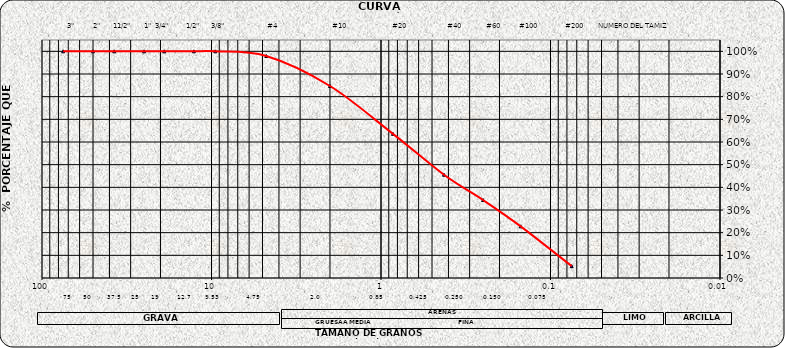
| Category | Series 0 |
|---|---|
| 75.0 | 1 |
| 50.0 | 1 |
| 37.5 | 1 |
| 25.0 | 1 |
| 19.0 | 1 |
| 12.7 | 1 |
| 9.5 | 1 |
| 4.75 | 0.979 |
| 2.0 | 0.847 |
| 0.85 | 0.636 |
| 0.425 | 0.456 |
| 0.25 | 0.344 |
| 0.15 | 0.228 |
| 0.075 | 0.052 |
| nan | 0 |